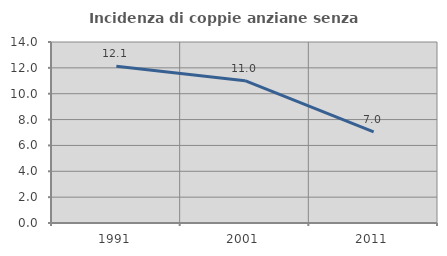
| Category | Incidenza di coppie anziane senza figli  |
|---|---|
| 1991.0 | 12.128 |
| 2001.0 | 11.007 |
| 2011.0 | 7.047 |